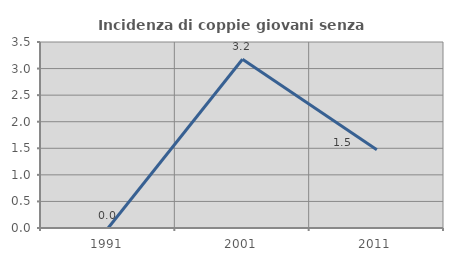
| Category | Incidenza di coppie giovani senza figli |
|---|---|
| 1991.0 | 0 |
| 2001.0 | 3.175 |
| 2011.0 | 1.471 |